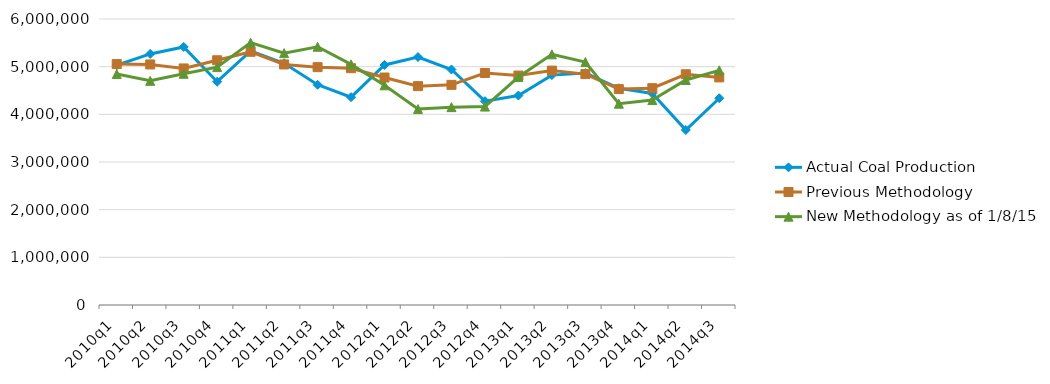
| Category | Actual Coal Production | Previous Methodology | New Methodology as of 1/8/15 |
|---|---|---|---|
| 2010q1 | 5029517 | 5055051 | 4844615 |
| 2010q2 | 5267604 | 5046635 | 4702704 |
| 2010q3 | 5414337 | 4962596 | 4850676 |
| 2010q4 | 4684062 | 5134087 | 4990654 |
| 2011q1 | 5329258 | 5312112 | 5503583 |
| 2011q2 | 5071723 | 5046523 | 5284375 |
| 2011q3 | 4620436 | 4989820 | 5417621 |
| 2011q4 | 4359592 | 4967813 | 5048371 |
| 2012q1 | 5035240 | 4772276 | 4608597 |
| 2012q2 | 5202711 | 4591159 | 4110537 |
| 2012q3 | 4940767 | 4618189 | 4151035 |
| 2012q4 | 4275876 | 4866595 | 4162577 |
| 2013q1 | 4394687 | 4813834 | 4782823 |
| 2013q2 | 4823006 | 4917521 | 5258681 |
| 2013q3 | 4864527 | 4843911 | 5096309 |
| 2013q4 | 4546197 | 4529353 | 4222858 |
| 2014q1 | 4438933 | 4548462 | 4299130 |
| 2014q2 | 3670997 | 4840738 | 4720055 |
| 2014q3 | 4337615 | 4774793 | 4923354 |